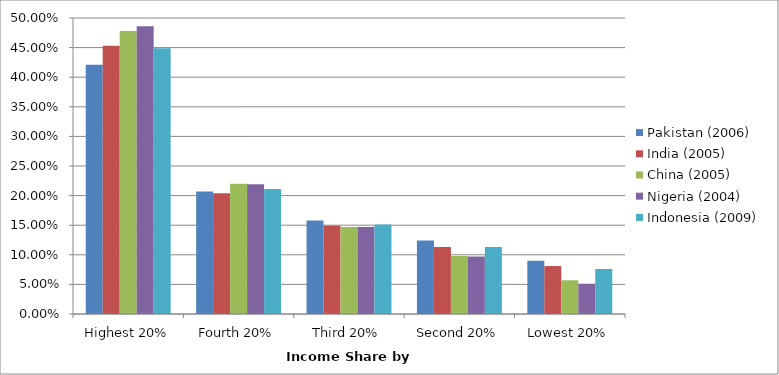
| Category | Pakistan (2006) | India (2005) | China (2005) | Nigeria (2004) | Indonesia (2009) |
|---|---|---|---|---|---|
| Highest 20% | 0.421 | 0.453 | 0.478 | 0.486 | 0.449 |
| Fourth 20% | 0.207 | 0.204 | 0.22 | 0.219 | 0.211 |
| Third 20% | 0.158 | 0.149 | 0.147 | 0.147 | 0.151 |
| Second 20% | 0.124 | 0.113 | 0.098 | 0.097 | 0.113 |
| Lowest 20% | 0.09 | 0.081 | 0.057 | 0.051 | 0.076 |